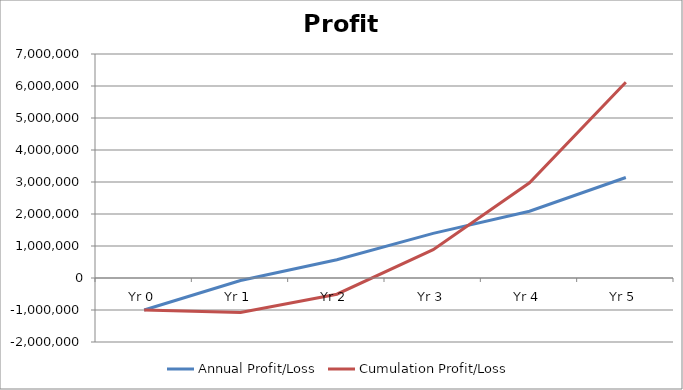
| Category | Annual Profit/Loss | Cumulation Profit/Loss |
|---|---|---|
| Yr 0 | -1000000 | -1000000 |
| Yr 1 | -78000 | -1078000 |
| Yr 2 | 570974.469 | -507025.531 |
| Yr 3 | 1393951.125 | 886925.594 |
| Yr 4 | 2086442.602 | 2973368.196 |
| Yr 5 | 3141134.042 | 6114502.238 |